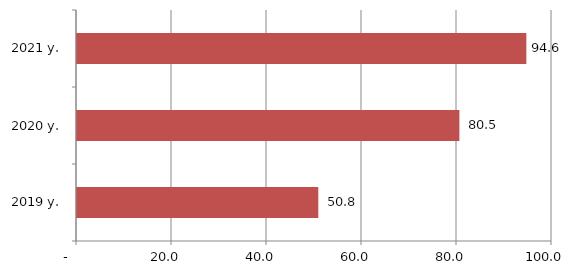
| Category | Series 0 |
|---|---|
| 2019 y. | 50.8 |
| 2020 y. | 80.5 |
| 2021 y. | 94.6 |